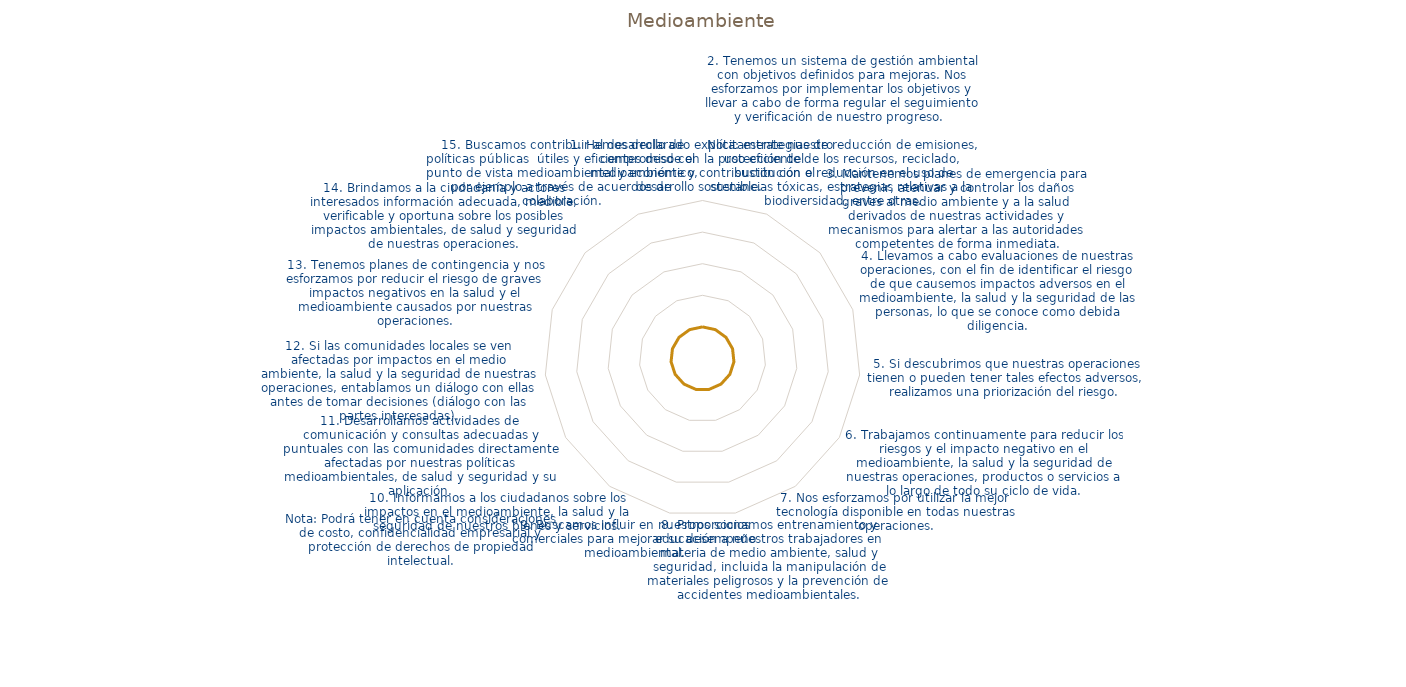
| Category | Series 0 |
|---|---|
| 1. Hemos declarado explícitamente nuestro compromiso con la protección del medioambiente y contribución con el desarrollo sostenible.  | 1 |
| 2. Tenemos un sistema de gestión ambiental con objetivos definidos para mejoras. Nos esforzamos por implementar los objetivos y llevar a cabo de forma regular el seguimiento y verificación de nuestro progreso.  

Nota: estrategias de reducción de emisiones | 1 |
| 3. Mantenemos planes de emergencia para prevenir, atenuar y controlar los daños graves al medio ambiente y a la salud derivados de nuestras actividades y mecanismos para alertar a las autoridades competentes de forma inmediata. | 1 |
| 4. Llevamos a cabo evaluaciones de nuestras operaciones, con el fin de identificar el riesgo de que causemos impactos adversos en el medioambiente, la salud y la seguridad de las personas, lo que se conoce como debida diligencia. | 1 |
| 5. Si descubrimos que nuestras operaciones tienen o pueden tener tales efectos adversos, realizamos una priorización del riesgo. | 1 |
| 6. Trabajamos continuamente para reducir los riesgos y el impacto negativo en el medioambiente, la salud y la seguridad de nuestras operaciones, productos o servicios a lo largo de todo su ciclo de vida. | 1 |
| 7. Nos esforzamos por utilizar la mejor tecnología disponible en todas nuestras operaciones. | 1 |
| 8. Proporcionamos entrenamiento y educación a nuestros trabajadores en materia de medio ambiente, salud y seguridad, incluida la manipulación de materiales peligrosos y la prevención de accidentes medioambientales. | 1 |
| 9. Buscamos influir en nuestros socios comerciales para mejorar su desempeño medioambiental. | 1 |
| 10. Informamos a los ciudadanos sobre los impactos en el medioambiente, la salud y la seguridad de nuestros bienes y servicios. | 1 |
| 11. Desarrollamos actividades de comunicación y consultas adecuadas y puntuales con las comunidades directamente afectadas por nuestras políticas medioambientales, de salud y seguridad y su aplicación.

Nota: Podrá tener en cuenta consideraciones de costo, | 1 |
| 12. Si las comunidades locales se ven afectadas por impactos en el medio ambiente, la salud y la seguridad de nuestras operaciones, entablamos un diálogo con ellas antes de tomar decisiones (diálogo con las partes interesadas). | 1 |
| 13. Tenemos planes de contingencia y nos esforzamos por reducir el riesgo de graves impactos negativos en la salud y el medioambiente causados por nuestras operaciones. | 1 |
| 14. Brindamos a la ciudadanía y actores interesados información adecuada, medible, verificable y oportuna sobre los posibles impactos ambientales, de salud y seguridad de nuestras operaciones. | 1 |
| 15. Buscamos contribuir al desarrollo de políticas públicas  útiles y eficientes desde el punto de vista medioambiental y económico, por ejemplo a través de acuerdos de colaboración. | 1 |